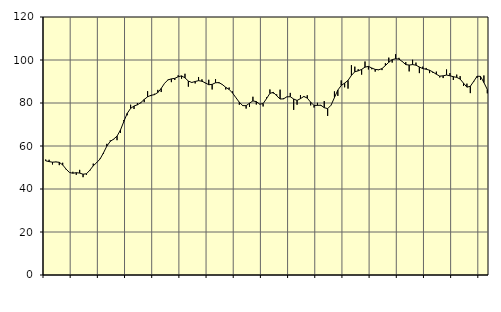
| Category | Piggar | Series 1 |
|---|---|---|
| nan | 53.7 | 53.11 |
| 87.0 | 53.6 | 52.75 |
| 87.0 | 51.4 | 52.47 |
| 87.0 | 52.7 | 52.59 |
| nan | 51.1 | 52.42 |
| 88.0 | 52.2 | 51.21 |
| 88.0 | 49.1 | 49.26 |
| 88.0 | 47.6 | 47.66 |
| nan | 48 | 47.34 |
| 89.0 | 46.6 | 47.58 |
| 89.0 | 48.9 | 47.41 |
| 89.0 | 45.5 | 46.87 |
| nan | 46.6 | 47.09 |
| 90.0 | 48.5 | 48.74 |
| 90.0 | 51.8 | 50.79 |
| 90.0 | 52.1 | 52.25 |
| nan | 54.1 | 53.95 |
| 91.0 | 56.3 | 56.77 |
| 91.0 | 61 | 59.95 |
| 91.0 | 62.6 | 62.14 |
| nan | 63 | 63.2 |
| 92.0 | 62.7 | 64.6 |
| 92.0 | 66.1 | 67.39 |
| 92.0 | 72.1 | 71.39 |
| nan | 74.3 | 75.21 |
| 93.0 | 79.2 | 77.5 |
| 93.0 | 77.2 | 78.6 |
| 93.0 | 80 | 79.16 |
| nan | 79.9 | 80.17 |
| 94.0 | 80.4 | 81.65 |
| 94.0 | 85.5 | 82.88 |
| 94.0 | 83.2 | 83.59 |
| nan | 84.3 | 83.87 |
| 95.0 | 86.1 | 84.85 |
| 95.0 | 85.1 | 86.79 |
| 95.0 | 89.2 | 89.17 |
| nan | 90.9 | 90.75 |
| 96.0 | 89.7 | 91.22 |
| 96.0 | 90.7 | 91.46 |
| 96.0 | 92.9 | 92.21 |
| nan | 91.3 | 92.62 |
| 97.0 | 93.6 | 91.69 |
| 97.0 | 87.6 | 90.2 |
| 97.0 | 89.7 | 89.55 |
| nan | 89.1 | 90 |
| 98.0 | 92.1 | 90.39 |
| 98.0 | 91 | 90.12 |
| 98.0 | 89.2 | 89.36 |
| nan | 90.8 | 88.49 |
| 99.0 | 86.3 | 88.67 |
| 99.0 | 91.1 | 89.41 |
| 99.0 | 89.2 | 89.5 |
| nan | 88.4 | 88.58 |
| 0.0 | 86.3 | 87.29 |
| 0.0 | 87.2 | 86.32 |
| 0.0 | 85.4 | 84.65 |
| nan | 82.5 | 82.47 |
| 1.0 | 79.2 | 80.34 |
| 1.0 | 79 | 78.79 |
| 1.0 | 77.4 | 78.75 |
| nan | 78.2 | 79.91 |
| 2.0 | 82.9 | 80.96 |
| 2.0 | 79.3 | 80.65 |
| 2.0 | 79.6 | 79.46 |
| nan | 78.4 | 79.72 |
| 3.0 | 82.6 | 82.02 |
| 3.0 | 86.3 | 84.48 |
| 3.0 | 84.4 | 84.96 |
| nan | 84 | 83.35 |
| 4.0 | 86.2 | 81.86 |
| 4.0 | 82.2 | 81.92 |
| 4.0 | 82.8 | 82.87 |
| nan | 84.7 | 82.92 |
| 5.0 | 76.8 | 81.85 |
| 5.0 | 79.2 | 81.19 |
| 5.0 | 83.7 | 82.03 |
| nan | 82.8 | 83.04 |
| 6.0 | 83.6 | 82.28 |
| 6.0 | 78.9 | 80.36 |
| 6.0 | 77.9 | 78.85 |
| nan | 80.1 | 78.91 |
| 7.0 | 78.7 | 78.96 |
| 7.0 | 80.9 | 77.83 |
| 7.0 | 74 | 77.37 |
| nan | 79 | 78.97 |
| 8.0 | 85.4 | 82.52 |
| 8.0 | 83.3 | 86.02 |
| 8.0 | 90.5 | 88.16 |
| nan | 87.3 | 89.24 |
| 9.0 | 86.7 | 90.51 |
| 9.0 | 97.6 | 92.83 |
| 9.0 | 96.9 | 94.53 |
| nan | 95.7 | 94.96 |
| 10.0 | 93.2 | 95.63 |
| 10.0 | 99.3 | 96.68 |
| 10.0 | 95.6 | 97.03 |
| nan | 95.7 | 96.26 |
| 11.0 | 94.6 | 95.62 |
| 11.0 | 95.3 | 95.45 |
| 11.0 | 95.3 | 95.99 |
| nan | 98.5 | 97.42 |
| 12.0 | 101.1 | 98.94 |
| 12.0 | 98.8 | 100.16 |
| 12.0 | 102.7 | 100.58 |
| nan | 101 | 100.41 |
| 13.0 | 99.1 | 99.25 |
| 13.0 | 99 | 97.86 |
| 13.0 | 94.7 | 97.64 |
| nan | 100.1 | 97.87 |
| 14.0 | 98.8 | 97.6 |
| 14.0 | 93.9 | 96.75 |
| 14.0 | 96.9 | 95.99 |
| nan | 96.3 | 95.71 |
| 15.0 | 93.9 | 95.24 |
| 15.0 | 94 | 94.4 |
| 15.0 | 94.6 | 93.38 |
| nan | 91.9 | 92.5 |
| 16.0 | 91.6 | 92.64 |
| 16.0 | 95.6 | 93 |
| 16.0 | 93.9 | 92.67 |
| nan | 90.7 | 92.23 |
| 17.0 | 93.2 | 91.92 |
| 17.0 | 92.5 | 91.13 |
| 17.0 | 87.9 | 89.22 |
| nan | 89 | 87.38 |
| 18.0 | 84.6 | 87.77 |
| 18.0 | 89.8 | 90.06 |
| 18.0 | 91.7 | 92.46 |
| nan | 90.7 | 92.38 |
| 19.0 | 92.8 | 89.5 |
| 19.0 | 84.5 | 86.28 |